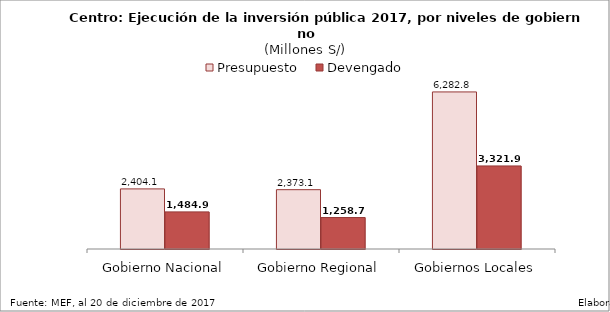
| Category | Presupuesto | Devengado |
|---|---|---|
| Gobierno Nacional | 2404.105 | 1484.853 |
| Gobierno Regional | 2373.056 | 1258.693 |
| Gobiernos Locales | 6282.837 | 3321.931 |